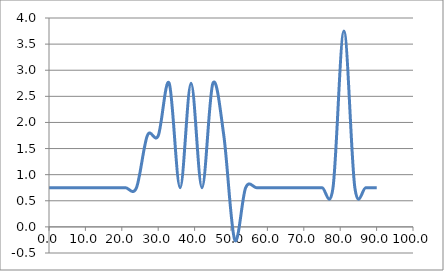
| Category | Elevation (in.) |
|---|---|
| 0.024 | 0.75 |
| 3.024 | 0.75 |
| 6.024 | 0.75 |
| 9.024000000000001 | 0.75 |
| 12.024000000000001 | 0.75 |
| 15.024000000000001 | 0.75 |
| 18.024 | 0.75 |
| 21.024 | 0.75 |
| 24.023999999999997 | 0.75 |
| 27.023999999999997 | 1.75 |
| 30.023999999999997 | 1.75 |
| 33.024 | 2.75 |
| 36.024 | 0.75 |
| 39.024 | 2.75 |
| 42.024 | 0.75 |
| 45.024 | 2.75 |
| 48.024 | 1.75 |
| 51.024 | -0.25 |
| 54.024 | 0.75 |
| 57.024 | 0.75 |
| 60.024 | 0.75 |
| 63.024 | 0.75 |
| 66.024 | 0.75 |
| 69.024 | 0.75 |
| 72.024 | 0.75 |
| 75.024 | 0.75 |
| 78.024 | 0.75 |
| 81.024 | 3.75 |
| 84.024 | 0.75 |
| 87.024 | 0.75 |
| 90.024 | 0.75 |